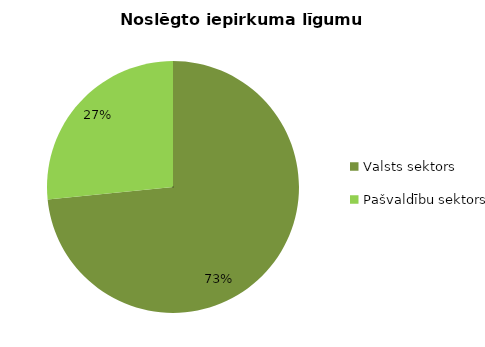
| Category | Noslēgto iepirkuma līgumu skaits |
|---|---|
| Valsts sektors | 7096 |
| Pašvaldību sektors | 2571 |